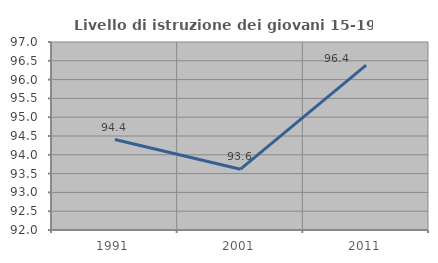
| Category | Livello di istruzione dei giovani 15-19 anni |
|---|---|
| 1991.0 | 94.406 |
| 2001.0 | 93.617 |
| 2011.0 | 96.386 |